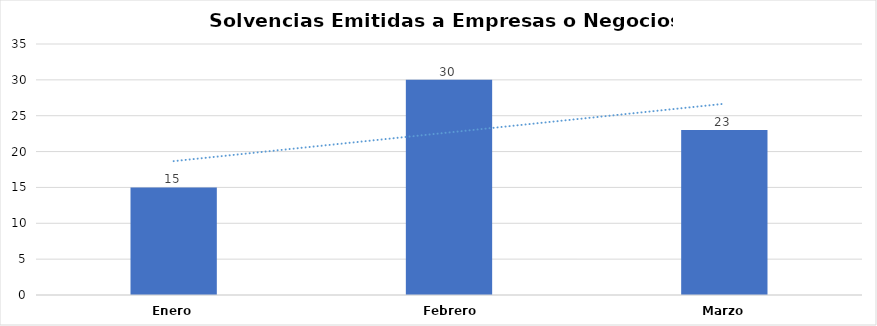
| Category | Series 0 |
|---|---|
| Enero | 15 |
| Febrero  | 30 |
| Marzo | 23 |